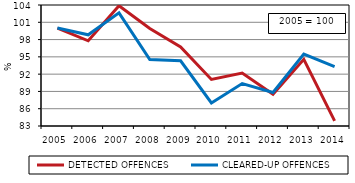
| Category | DETECTED OFFENCES | CLEARED-UP OFFENCES |
|---|---|---|
| 2005.0 | 100 | 100 |
| 2006.0 | 97.787 | 98.828 |
| 2007.0 | 103.875 | 102.64 |
| 2008.0 | 99.924 | 94.548 |
| 2009.0 | 96.736 | 94.325 |
| 2010.0 | 91.085 | 86.993 |
| 2011.0 | 92.187 | 90.359 |
| 2012.0 | 88.51 | 88.828 |
| 2013.0 | 94.567 | 95.491 |
| 2014.0 | 83.898 | 93.315 |